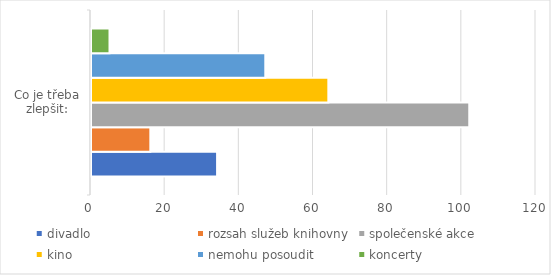
| Category | divadlo | rozsah služeb knihovny | společenské akce | kino | nemohu posoudit | koncerty |
|---|---|---|---|---|---|---|
| 0 | 34 | 16 | 102 | 64 | 47 | 5 |